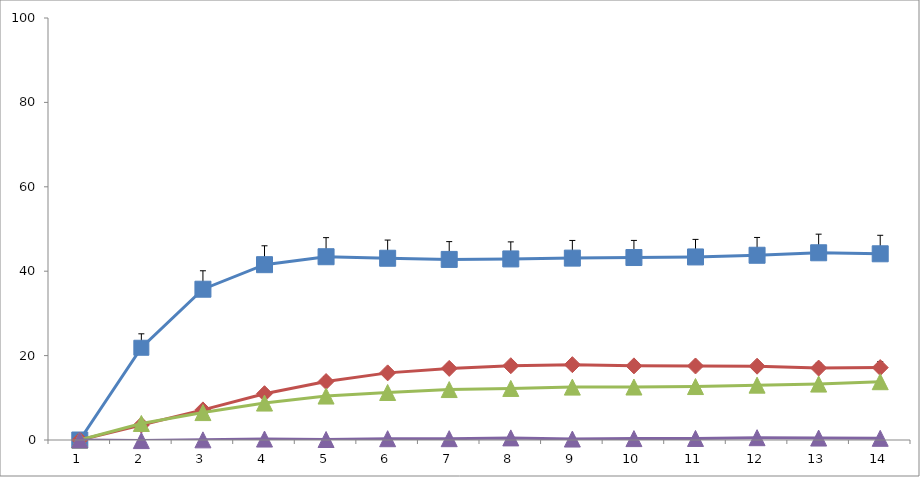
| Category | Series 0 | Series 1 | Series 2 | Series 3 |
|---|---|---|---|---|
| 0 | 0 | 0 | 0 | 0 |
| 1 | 21.859 | 3.556 | 3.92 | -0.14 |
| 2 | 35.73 | 7.131 | 6.498 | 0.034 |
| 3 | 41.544 | 10.965 | 8.753 | 0.225 |
| 4 | 43.431 | 13.855 | 10.412 | 0.116 |
| 5 | 43.071 | 15.906 | 11.261 | 0.304 |
| 6 | 42.792 | 16.963 | 11.955 | 0.311 |
| 7 | 42.908 | 17.599 | 12.219 | 0.497 |
| 8 | 43.1 | 17.855 | 12.532 | 0.227 |
| 9 | 43.241 | 17.566 | 12.554 | 0.33 |
| 10 | 43.378 | 17.536 | 12.666 | 0.368 |
| 11 | 43.777 | 17.489 | 13 | 0.547 |
| 12 | 44.366 | 17.043 | 13.25 | 0.463 |
| 13 | 44.127 | 17.163 | 13.813 | 0.4 |